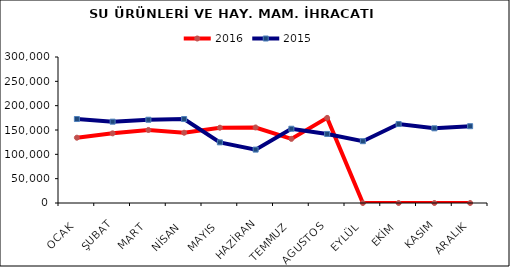
| Category | 2016 | 2015 |
|---|---|---|
| OCAK | 134179.818 | 172543.833 |
| ŞUBAT | 143119.481 | 167106.447 |
| MART | 150086.955 | 171068.19 |
| NİSAN | 144333.379 | 172518.286 |
| MAYIS | 154677.591 | 124616.548 |
| HAZİRAN | 155174.449 | 109718.507 |
| TEMMUZ | 131776.653 | 152578.298 |
| AGUSTOS | 174874.34 | 141907.613 |
| EYLÜL | 0 | 126984.497 |
| EKİM | 0 | 162255.214 |
| KASIM | 0 | 153455.329 |
| ARALIK | 0 | 157827.899 |